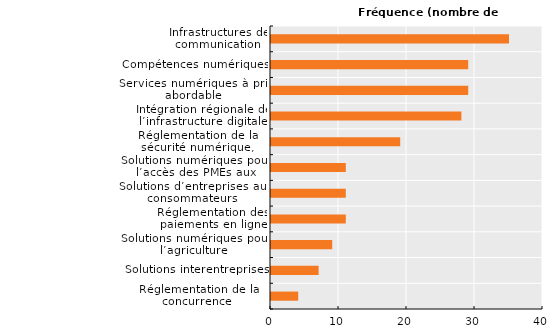
| Category | Series 0 |
|---|---|
| Réglementation de la concurrence 
et des droits de propriété intellectuelle | 4 |
| Solutions interentreprises | 7 |
| Solutions numériques pour l’agriculture | 9 |
| Réglementation des paiements en ligne | 11 |
| Solutions d’entreprises aux consommateurs 
(commerce électronique, par exemple) | 11 |
| Solutions numériques pour l’accès des PMEs aux financements | 11 |
| Réglementation de la sécurité numérique, l’identité numérique,
le respect de la vie privée et la protection des données | 19 |
| Intégration régionale de l’infrastructure digitale | 28 |
| Services numériques à prix abordable | 29 |
| Compétences numériques | 29 |
| Infrastructures de communication | 35 |